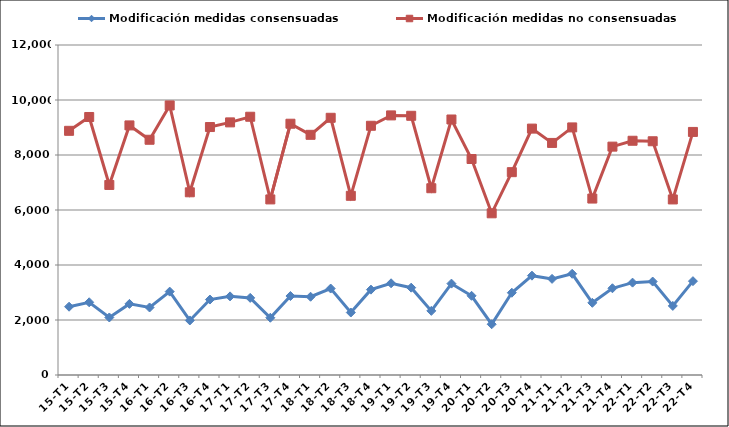
| Category | Modificación medidas consensuadas | Modificación medidas no consensuadas |
|---|---|---|
| 15-T1 | 2483 | 8879 |
| 15-T2 | 2644 | 9382 |
| 15-T3 | 2092 | 6911 |
| 15-T4 | 2586 | 9076 |
| 16-T1 | 2455 | 8554 |
| 16-T2 | 3032 | 9802 |
| 16-T3 | 1983 | 6644 |
| 16-T4 | 2744 | 9017 |
| 17-T1 | 2859 | 9186 |
| 17-T2 | 2804 | 9391 |
| 17-T3 | 2082 | 6385 |
| 17-T4 | 2872 | 9137 |
| 18-T1 | 2846 | 8734 |
| 18-T2 | 3144 | 9353 |
| 18-T3 | 2272 | 6516 |
| 18-T4 | 3104 | 9063 |
| 19-T1 | 3335 | 9440 |
| 19-T2 | 3176 | 9426 |
| 19-T3 | 2332 | 6792 |
| 19-T4 | 3323 | 9291 |
| 20-T1 | 2880 | 7854 |
| 20-T2 | 1846 | 5880 |
| 20-T3 | 2991 | 7376 |
| 20-T4 | 3612 | 8960 |
| 21-T1 | 3496 | 8439 |
| 21-T2 | 3680 | 9003 |
| 21-T3 | 2625 | 6416 |
| 21-T4 | 3154 | 8304 |
| 22-T1 | 3359 | 8518 |
| 22-T2 | 3398 | 8500 |
| 22-T3 | 2512 | 6384 |
| 22-T4 | 3412 | 8839 |